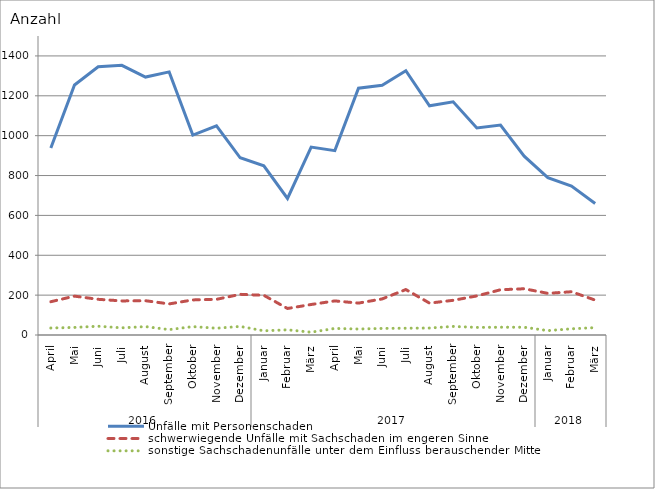
| Category | Unfälle mit Personenschaden | schwerwiegende Unfälle mit Sachschaden im engeren Sinne | sonstige Sachschadenunfälle unter dem Einfluss berauschender Mittel |
|---|---|---|---|
| 0 | 938 | 167 | 35 |
| 1 | 1254 | 195 | 38 |
| 2 | 1346 | 179 | 44 |
| 3 | 1353 | 171 | 36 |
| 4 | 1294 | 172 | 42 |
| 5 | 1320 | 156 | 27 |
| 6 | 1003 | 176 | 42 |
| 7 | 1049 | 179 | 34 |
| 8 | 889 | 204 | 43 |
| 9 | 849 | 199 | 21 |
| 10 | 685 | 133 | 26 |
| 11 | 943 | 153 | 14 |
| 12 | 925 | 171 | 33 |
| 13 | 1238 | 160 | 30 |
| 14 | 1253 | 181 | 33 |
| 15 | 1326 | 228 | 34 |
| 16 | 1150 | 160 | 35 |
| 17 | 1170 | 174 | 43 |
| 18 | 1039 | 196 | 38 |
| 19 | 1053 | 227 | 39 |
| 20 | 897 | 232 | 39 |
| 21 | 789 | 209 | 22 |
| 22 | 747 | 217 | 31 |
| 23 | 660 | 175 | 37 |